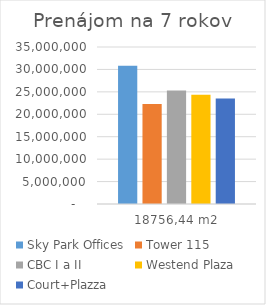
| Category | Sky Park Offices | Tower 115 | CBC I a II | Westend Plaza | Court+Plazza |
|---|---|---|---|---|---|
| 18756,44 m2 | 30823848.72 | 22319739.994 | 25287432.408 | 24352187.832 | 23495387.832 |